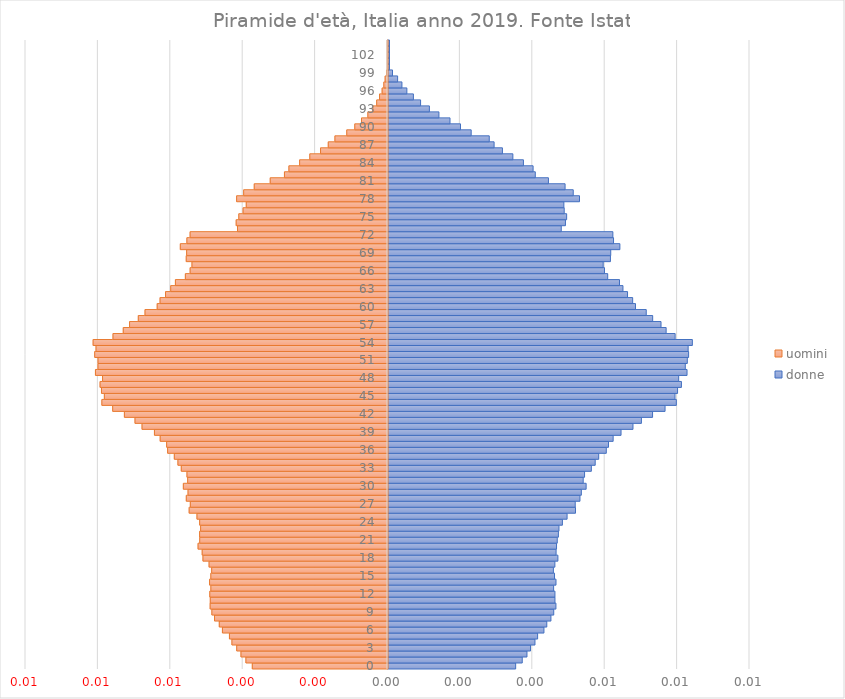
| Category | donne  | uomini |
|---|---|---|
| 0.0 | 0.004 | -0.004 |
| 1.0 | 0.004 | -0.004 |
| 2.0 | 0.004 | -0.004 |
| 3.0 | 0.004 | -0.004 |
| 4.0 | 0.004 | -0.004 |
| 5.0 | 0.004 | -0.004 |
| 6.0 | 0.004 | -0.005 |
| 7.0 | 0.004 | -0.005 |
| 8.0 | 0.005 | -0.005 |
| 9.0 | 0.005 | -0.005 |
| 10.0 | 0.005 | -0.005 |
| 11.0 | 0.005 | -0.005 |
| 12.0 | 0.005 | -0.005 |
| 13.0 | 0.005 | -0.005 |
| 14.0 | 0.005 | -0.005 |
| 15.0 | 0.005 | -0.005 |
| 16.0 | 0.005 | -0.005 |
| 17.0 | 0.005 | -0.005 |
| 18.0 | 0.005 | -0.005 |
| 19.0 | 0.005 | -0.005 |
| 20.0 | 0.005 | -0.005 |
| 21.0 | 0.005 | -0.005 |
| 22.0 | 0.005 | -0.005 |
| 23.0 | 0.005 | -0.005 |
| 24.0 | 0.005 | -0.005 |
| 25.0 | 0.005 | -0.005 |
| 26.0 | 0.005 | -0.005 |
| 27.0 | 0.005 | -0.005 |
| 28.0 | 0.005 | -0.006 |
| 29.0 | 0.005 | -0.006 |
| 30.0 | 0.005 | -0.006 |
| 31.0 | 0.005 | -0.006 |
| 32.0 | 0.005 | -0.006 |
| 33.0 | 0.006 | -0.006 |
| 34.0 | 0.006 | -0.006 |
| 35.0 | 0.006 | -0.006 |
| 36.0 | 0.006 | -0.006 |
| 37.0 | 0.006 | -0.006 |
| 38.0 | 0.006 | -0.006 |
| 39.0 | 0.006 | -0.006 |
| 40.0 | 0.007 | -0.007 |
| 41.0 | 0.007 | -0.007 |
| 42.0 | 0.007 | -0.007 |
| 43.0 | 0.008 | -0.008 |
| 44.0 | 0.008 | -0.008 |
| 45.0 | 0.008 | -0.008 |
| 46.0 | 0.008 | -0.008 |
| 47.0 | 0.008 | -0.008 |
| 48.0 | 0.008 | -0.008 |
| 49.0 | 0.008 | -0.008 |
| 50.0 | 0.008 | -0.008 |
| 51.0 | 0.008 | -0.008 |
| 52.0 | 0.008 | -0.008 |
| 53.0 | 0.008 | -0.008 |
| 54.0 | 0.008 | -0.008 |
| 55.0 | 0.008 | -0.008 |
| 56.0 | 0.008 | -0.007 |
| 57.0 | 0.008 | -0.007 |
| 58.0 | 0.007 | -0.007 |
| 59.0 | 0.007 | -0.007 |
| 60.0 | 0.007 | -0.006 |
| 61.0 | 0.007 | -0.006 |
| 62.0 | 0.007 | -0.006 |
| 63.0 | 0.006 | -0.006 |
| 64.0 | 0.006 | -0.006 |
| 65.0 | 0.006 | -0.006 |
| 66.0 | 0.006 | -0.005 |
| 67.0 | 0.006 | -0.005 |
| 68.0 | 0.006 | -0.006 |
| 69.0 | 0.006 | -0.006 |
| 70.0 | 0.006 | -0.006 |
| 71.0 | 0.006 | -0.006 |
| 72.0 | 0.006 | -0.005 |
| 73.0 | 0.005 | -0.004 |
| 74.0 | 0.005 | -0.004 |
| 75.0 | 0.005 | -0.004 |
| 76.0 | 0.005 | -0.004 |
| 77.0 | 0.005 | -0.004 |
| 78.0 | 0.005 | -0.004 |
| 79.0 | 0.005 | -0.004 |
| 80.0 | 0.005 | -0.004 |
| 81.0 | 0.004 | -0.003 |
| 82.0 | 0.004 | -0.003 |
| 83.0 | 0.004 | -0.003 |
| 84.0 | 0.004 | -0.002 |
| 85.0 | 0.003 | -0.002 |
| 86.0 | 0.003 | -0.002 |
| 87.0 | 0.003 | -0.002 |
| 88.0 | 0.003 | -0.001 |
| 89.0 | 0.002 | -0.001 |
| 90.0 | 0.002 | -0.001 |
| 91.0 | 0.002 | -0.001 |
| 92.0 | 0.001 | -0.001 |
| 93.0 | 0.001 | 0 |
| 94.0 | 0.001 | 0 |
| 95.0 | 0.001 | 0 |
| 96.0 | 0.001 | 0 |
| 97.0 | 0 | 0 |
| 98.0 | 0 | 0 |
| 99.0 | 0 | 0 |
| 100.0 | 0 | 0 |
| 101.0 | 0 | 0 |
| 102.0 | 0 | 0 |
| 103.0 | 0 | 0 |
| 104.0 | 0 | 0 |